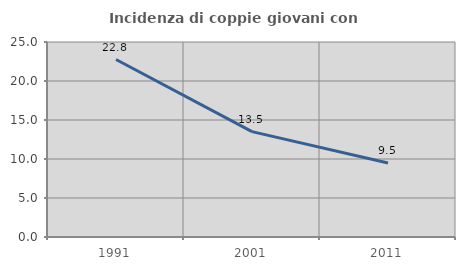
| Category | Incidenza di coppie giovani con figli |
|---|---|
| 1991.0 | 22.755 |
| 2001.0 | 13.506 |
| 2011.0 | 9.492 |